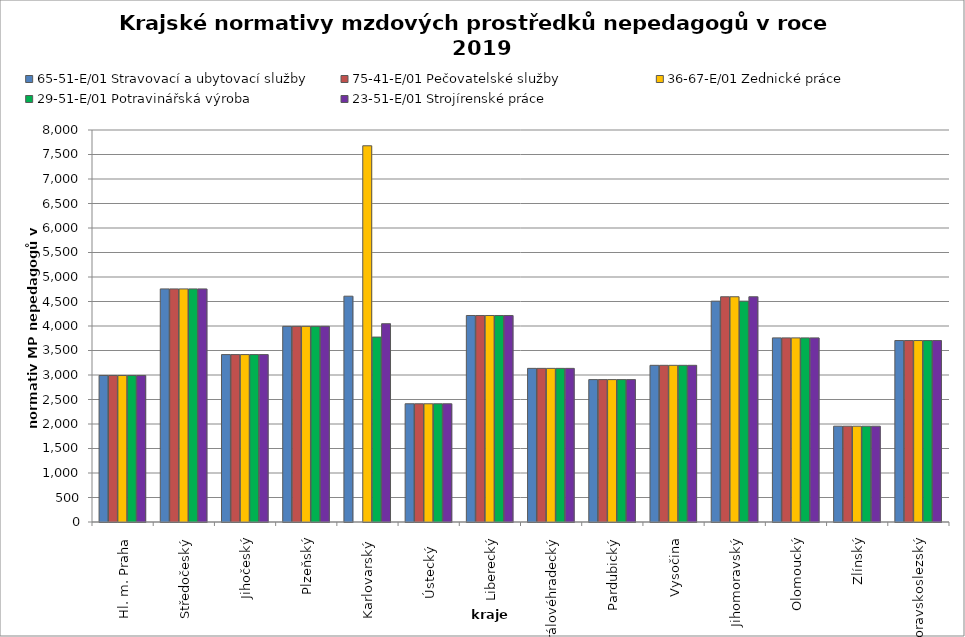
| Category | 65-51-E/01 Stravovací a ubytovací služby | 75-41-E/01 Pečovatelské služby | 36-67-E/01 Zednické práce | 29-51-E/01 Potravinářská výroba | 23-51-E/01 Strojírenské práce |
|---|---|---|---|---|---|
| Hl. m. Praha | 2990.184 | 2990.184 | 2990.184 | 2990.184 | 2990.184 |
| Středočeský | 4756.8 | 4756.8 | 4756.8 | 4756.8 | 4756.8 |
| Jihočeský | 3416.552 | 3416.552 | 3416.552 | 3416.552 | 3416.552 |
| Plzeňský | 3992.727 | 3992.727 | 3992.727 | 3992.727 | 3992.727 |
| Karlovarský  | 4608.365 | 0 | 7678.175 | 3774.055 | 4046.745 |
| Ústecký   | 2412.866 | 2412.866 | 2412.866 | 2412.866 | 2412.866 |
| Liberecký | 4214.357 | 4214.357 | 4214.357 | 4214.357 | 4214.357 |
| Královéhradecký | 3135.436 | 3135.436 | 3135.436 | 3135.436 | 3135.436 |
| Pardubický | 2905.979 | 2905.979 | 2905.979 | 2905.979 | 2905.979 |
| Vysočina | 3197.584 | 3197.584 | 3197.584 | 3197.584 | 3197.584 |
| Jihomoravský | 4506.792 | 4596.734 | 4596.734 | 4506.792 | 4596.734 |
| Olomoucký | 3757.538 | 3757.538 | 3757.538 | 3757.538 | 3757.538 |
| Zlínský | 1955.357 | 1955.357 | 1955.357 | 1955.357 | 1955.357 |
| Moravskoslezský | 3703.244 | 3703.244 | 3703.244 | 3703.244 | 3703.244 |